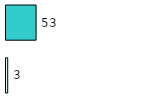
| Category | Series 0 | Series 1 |
|---|---|---|
| 0 | 3 | 53 |